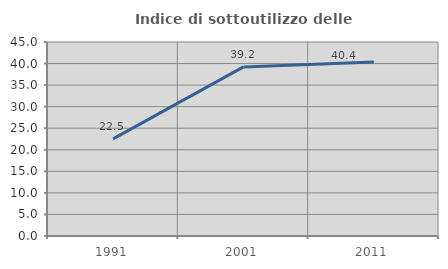
| Category | Indice di sottoutilizzo delle abitazioni  |
|---|---|
| 1991.0 | 22.521 |
| 2001.0 | 39.219 |
| 2011.0 | 40.36 |